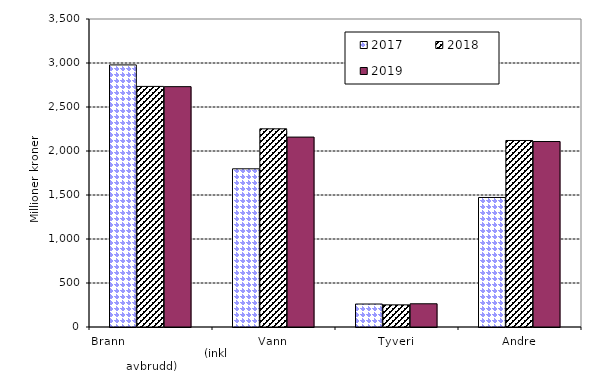
| Category | 2017 | 2018 | 2019 |
|---|---|---|---|
| Brann                                                       (inkl avbrudd) | 2978.266 | 2733.966 | 2731.245 |
| Vann | 1797.656 | 2251.792 | 2158.059 |
| Tyveri | 261.096 | 251.618 | 263.975 |
| Andre | 1471.808 | 2119.387 | 2107.771 |